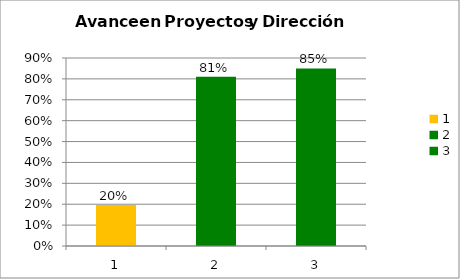
| Category | Series 0 |
|---|---|
| 0 | 0.196 |
| 1 | 0.81 |
| 2 | 0.85 |